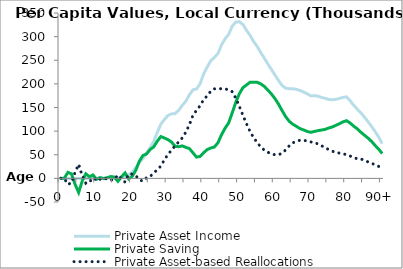
| Category | Private Asset Income | Private Saving | Private Asset-based Reallocations |
|---|---|---|---|
| 0 | 0 | -409.245 | 409.245 |
|  | 0 | 525.474 | -525.474 |
| 2 | 0 | 12805.084 | -12805.084 |
| 3 | 0 | 9387.738 | -9387.738 |
| 4 | 0 | -12558.258 | 12558.258 |
| 5 | 0 | -29832.312 | 29832.312 |
| 6 | 0 | -5765.637 | 5765.637 |
| 7 | 0 | 9784.287 | -9784.287 |
| 8 | 0 | 3561.134 | -3561.134 |
| 9 | 0 | 7210.538 | -7210.538 |
| 10 | 0 | -1906.809 | 1906.809 |
| 11 | 2.12 | 1633.27 | -1631.15 |
| 12 | 57.385 | -448.057 | 505.441 |
| 13 | 157.875 | 1436.102 | -1278.227 |
| 14 | 321.62 | 3934.869 | -3613.25 |
| 15 | 432.193 | 2745.736 | -2313.543 |
| 16 | 761.819 | -6263.197 | 7025.017 |
| 17 | 1489.593 | 3367.908 | -1878.314 |
| 18 | 3821.251 | 11604.66 | -7783.409 |
| 19 | 7664.911 | -1175.705 | 8840.617 |
| 20 | 13449.27 | 4268.715 | 9180.555 |
| 21 | 22872.784 | 17265.714 | 5607.07 |
| 22 | 33362.979 | 36342.029 | -2979.05 |
| 23 | 42497.37 | 48455.965 | -5958.595 |
| 24 | 52900.141 | 51595.419 | 1304.721 |
| 25 | 64776.311 | 60974.313 | 3801.998 |
| 26 | 77776.61 | 66499.871 | 11276.739 |
| 27 | 96913.578 | 78519.433 | 18394.145 |
| 28 | 114356.659 | 88523.894 | 25832.765 |
| 29 | 124673.241 | 85498.874 | 39174.367 |
| 30 | 132848.364 | 82072.551 | 50775.813 |
| 31 | 136491.363 | 76959.826 | 59531.537 |
| 32 | 136947.641 | 67945.559 | 69002.082 |
| 33 | 144089.501 | 67038.906 | 77050.595 |
| 34 | 154292.044 | 68742.518 | 85549.526 |
| 35 | 163287.408 | 65640.35 | 97647.059 |
| 36 | 176605.344 | 63173.65 | 113431.694 |
| 37 | 187444.462 | 54287.28 | 133157.183 |
| 38 | 189156.799 | 45017.544 | 144139.255 |
| 39 | 200054.007 | 46456.527 | 153597.48 |
| 40 | 221054.211 | 54296.707 | 166757.504 |
| 41 | 235666.498 | 60957.83 | 174708.668 |
| 42 | 248985.233 | 64308.338 | 184676.895 |
| 43 | 255883.34 | 66361.49 | 189521.851 |
| 44 | 264217.622 | 75273.467 | 188944.155 |
| 45 | 282335.125 | 92365.603 | 189969.523 |
| 46 | 295387.403 | 106167.276 | 189220.127 |
| 47 | 304855.082 | 117296.289 | 187558.793 |
| 48 | 322178.964 | 138669.551 | 183509.414 |
| 49 | 330858.944 | 161162.685 | 169696.259 |
| 50 | 331525.612 | 179203.753 | 152321.859 |
| 51 | 325606.473 | 192064.162 | 133542.311 |
| 52 | 313351.697 | 197789.992 | 115561.705 |
| 53 | 302605.056 | 203491.675 | 99113.381 |
| 54 | 289505.761 | 203552.981 | 85952.781 |
| 55 | 279163.931 | 203193.794 | 75970.137 |
| 56 | 266030.7 | 199969.042 | 66061.658 |
| 57 | 254350.131 | 194562.499 | 59787.632 |
| 58 | 241954.346 | 186700.959 | 55253.387 |
| 59 | 230186.839 | 178426.078 | 51760.76 |
| 60 | 218456.762 | 168528.885 | 49927.878 |
| 61 | 206684.691 | 156650.673 | 50034.018 |
| 62 | 196268.135 | 142999.19 | 53268.945 |
| 63 | 190743.761 | 130218.035 | 60525.726 |
| 64 | 189762.846 | 120579.847 | 69182.999 |
| 65 | 189673.973 | 114392.309 | 75281.664 |
| 66 | 188359.669 | 109996.086 | 78363.583 |
| 67 | 185989.086 | 105223.574 | 80765.512 |
| 68 | 182574.202 | 102544.031 | 80030.171 |
| 69 | 179071.665 | 99260.254 | 79811.411 |
| 70 | 174569.247 | 97482.687 | 77086.56 |
| 71 | 175102.329 | 99314.823 | 75787.506 |
| 72 | 174034.714 | 101002.5 | 73032.214 |
| 73 | 171279.202 | 102329.987 | 68949.215 |
| 74 | 169479.165 | 103733.357 | 65745.808 |
| 75 | 167193.63 | 106487.459 | 60706.17 |
| 76 | 166342.918 | 108747.141 | 57595.778 |
| 77 | 167116.413 | 112148.414 | 54967.999 |
| 78 | 169224.475 | 115644.797 | 53579.678 |
| 79 | 171326.378 | 119582.135 | 51744.243 |
| 80 | 172544.122 | 122123.668 | 50420.453 |
| 81 | 164485.054 | 117228.068 | 47256.986 |
| 82 | 154805.475 | 110652.468 | 44153.006 |
| 83 | 146475.577 | 104983.982 | 41491.595 |
| 84 | 138969.827 | 97846.454 | 41123.373 |
| 85 | 129838.459 | 91570.259 | 38268.2 |
| 86 | 120324.797 | 85353.207 | 34971.59 |
| 87 | 110014.957 | 78442.632 | 31572.325 |
| 88 | 99145.191 | 69721.708 | 29423.483 |
| 89 | 87425.31 | 62018.248 | 25407.063 |
| 90+ | 73480.467 | 52455.971 | 21024.496 |